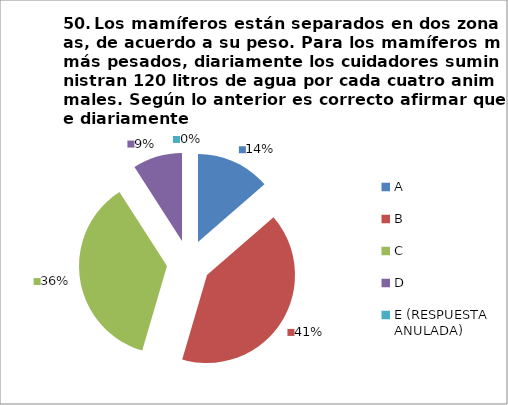
| Category | CANTIDAD DE RESPUESTAS PREGUNTA (50) | PORCENTAJE |
|---|---|---|
| A | 3 | 0.136 |
| B | 9 | 0.409 |
| C | 8 | 0.364 |
| D | 2 | 0.091 |
| E (RESPUESTA ANULADA) | 0 | 0 |